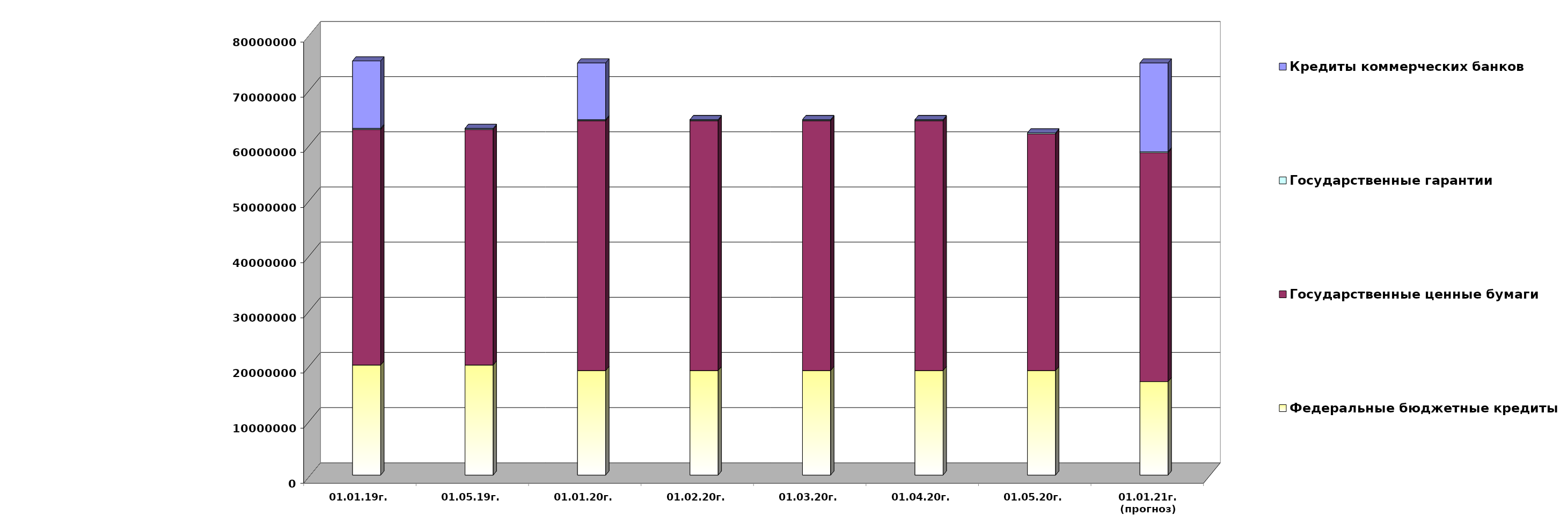
| Category | Федеральные бюджетные кредиты | Государственные ценные бумаги  | Государственные гарантии | Кредиты коммерческих банков |
|---|---|---|---|---|
| 01.01.19г. | 19957026.213 | 42700000 | 209872.86 | 12219963.75 |
| 01.05.19г. | 19957026.213 | 42700000 | 200735.86 | 0 |
| 01.01.20г. | 18954967.463 | 45300000 | 186330.02 | 10291177 |
| 01.02.20г. | 18954967.463 | 45300000 | 184738.25 | 0 |
| 01.03.20г. | 18954967.463 | 45300000 | 184738.25 | 0 |
| 01.04.20г. | 18954967.463 | 45300000 | 184738.25 | 0 |
| 01.05.20г. | 18954967.463 | 42900000 | 184738.25 | 0 |
| 01.01.21г.
(прогноз) | 16950850 | 41500000 | 179496.4 | 16097210.1 |